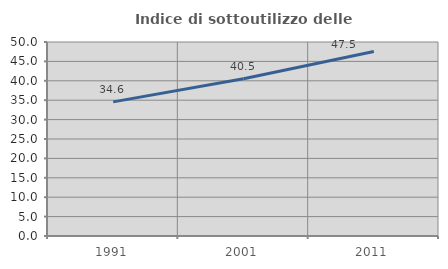
| Category | Indice di sottoutilizzo delle abitazioni  |
|---|---|
| 1991.0 | 34.569 |
| 2001.0 | 40.534 |
| 2011.0 | 47.546 |